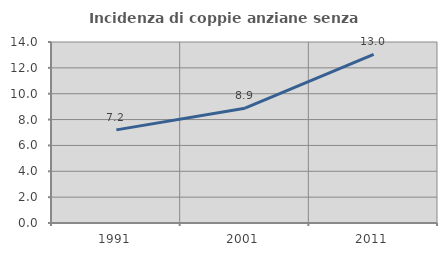
| Category | Incidenza di coppie anziane senza figli  |
|---|---|
| 1991.0 | 7.204 |
| 2001.0 | 8.88 |
| 2011.0 | 13.041 |